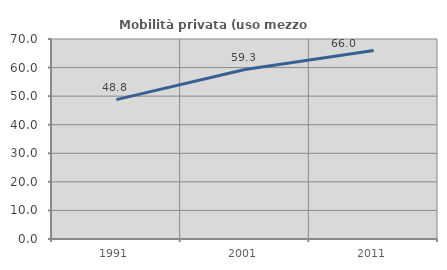
| Category | Mobilità privata (uso mezzo privato) |
|---|---|
| 1991.0 | 48.786 |
| 2001.0 | 59.325 |
| 2011.0 | 65.986 |